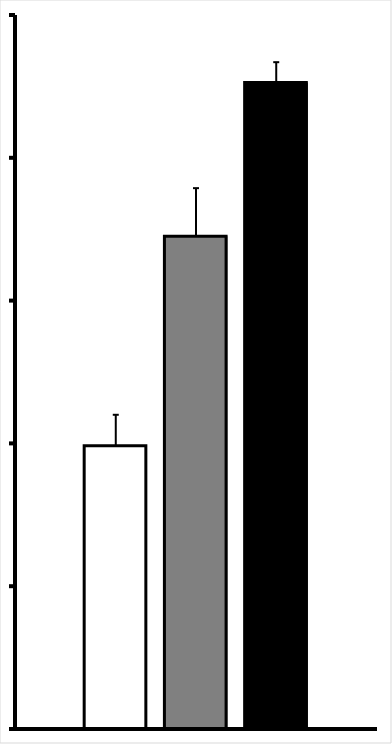
| Category | Cont | EAE_onset | EAE_peak |
|---|---|---|---|
| 0 | 9.918 | 17.249 | 22.634 |